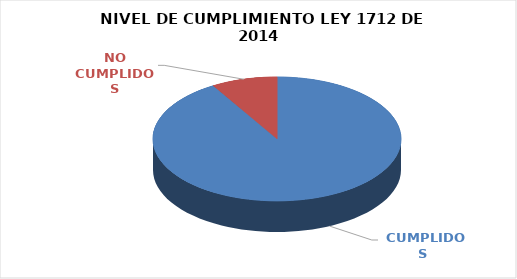
| Category | Series 0 |
|---|---|
|  CUMPLIDOS | 106 |
| NO CUMPLIDOS | 10 |